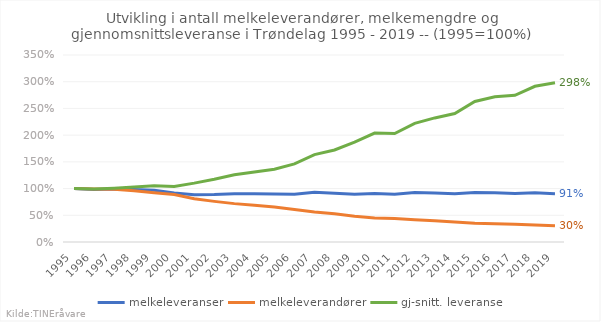
| Category | melkeleveranser | melkeleverandører | gj-snitt. leveranse |
|---|---|---|---|
| 1995.0 | 1 | 1 | 1 |
| 1996.0 | 0.985 | 0.993 | 0.991 |
| 1997.0 | 0.99 | 0.986 | 1.007 |
| 1998.0 | 0.984 | 0.959 | 1.03 |
| 1999.0 | 0.97 | 0.921 | 1.053 |
| 2000.0 | 0.919 | 0.888 | 1.04 |
| 2001.0 | 0.886 | 0.809 | 1.102 |
| 2002.0 | 0.89 | 0.76 | 1.175 |
| 2003.0 | 0.904 | 0.718 | 1.258 |
| 2004.0 | 0.902 | 0.687 | 1.312 |
| 2005.0 | 0.899 | 0.657 | 1.363 |
| 2006.0 | 0.893 | 0.609 | 1.461 |
| 2007.0 | 0.931 | 0.562 | 1.636 |
| 2008.0 | 0.913 | 0.528 | 1.722 |
| 2009.0 | 0.895 | 0.484 | 1.87 |
| 2010.0 | 0.907 | 0.449 | 2.04 |
| 2011.0 | 0.892 | 0.441 | 2.03 |
| 2012.0 | 0.925 | 0.417 | 2.22 |
| 2013.0 | 0.916 | 0.397 | 2.322 |
| 2014.0 | 0.903 | 0.375 | 2.405 |
| 2015.0 | 0.925 | 0.351 | 2.631 |
| 2016.0 | 0.922 | 0.34 | 2.72 |
| 2017.0 | 0.906 | 0.333 | 2.746 |
| 2018.0 | 0.92 | 0.317 | 2.914 |
| 2019.0 | 0.905 | 0.303 | 2.98 |